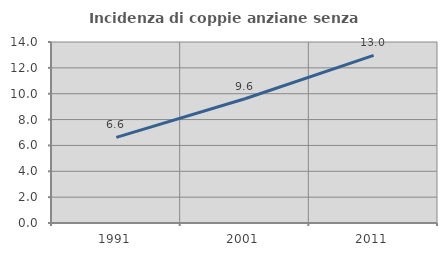
| Category | Incidenza di coppie anziane senza figli  |
|---|---|
| 1991.0 | 6.625 |
| 2001.0 | 9.613 |
| 2011.0 | 12.961 |